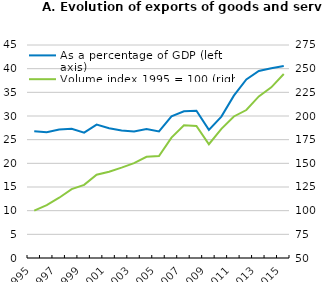
| Category | As a percentage of GDP (left axis) |
|---|---|
| 1995.0 | 26.766 |
| 1996.0 | 26.547 |
| 1997.0 | 27.145 |
| 1998.0 | 27.322 |
| 1999.0 | 26.472 |
| 2000.0 | 28.191 |
| 2001.0 | 27.424 |
| 2002.0 | 26.946 |
| 2003.0 | 26.752 |
| 2004.0 | 27.254 |
| 2005.0 | 26.734 |
| 2006.0 | 29.917 |
| 2007.0 | 31.006 |
| 2008.0 | 31.125 |
| 2009.0 | 27.081 |
| 2010.0 | 29.873 |
| 2011.0 | 34.291 |
| 2012.0 | 37.711 |
| 2013.0 | 39.516 |
| 2014.0 | 40.074 |
| 2015.0 | 40.555 |